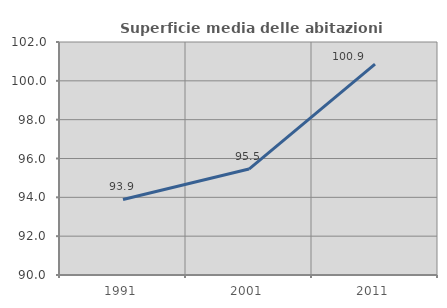
| Category | Superficie media delle abitazioni occupate |
|---|---|
| 1991.0 | 93.89 |
| 2001.0 | 95.456 |
| 2011.0 | 100.86 |